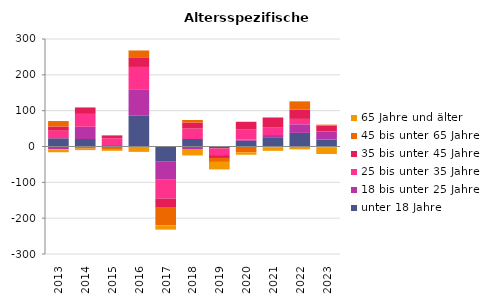
| Category | unter 18 Jahre | 18 bis unter 25 Jahre | 25 bis unter 35 Jahre | 35 bis unter 45 Jahre | 45 bis unter 65 Jahre | 65 Jahre und älter |
|---|---|---|---|---|---|---|
| 2013.0 | 23 | -8 | 21 | 12 | 15 | -8 |
| 2014.0 | 21 | 34 | 36 | 18 | -6 | -4 |
| 2015.0 | 0 | 4 | 19 | 8 | -7 | -5 |
| 2016.0 | 87 | 71 | 64 | 27 | 19 | -15 |
| 2017.0 | -41 | -50 | -54 | -26 | -49 | -12 |
| 2018.0 | 21 | -7 | 29 | 17 | 7 | -18 |
| 2019.0 | -5 | 0 | -19 | -8 | -11 | -21 |
| 2020.0 | 16 | 3 | 28 | 22 | -16 | -7 |
| 2021.0 | 24 | 8 | 22 | 27 | -3 | -9 |
| 2022.0 | 38 | 24 | 15 | 26 | 23 | -8 |
| 2023.0 | 19 | 23 | -2 | 16 | 3 | -19 |